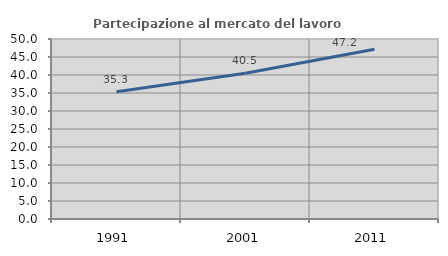
| Category | Partecipazione al mercato del lavoro  femminile |
|---|---|
| 1991.0 | 35.318 |
| 2001.0 | 40.474 |
| 2011.0 | 47.175 |